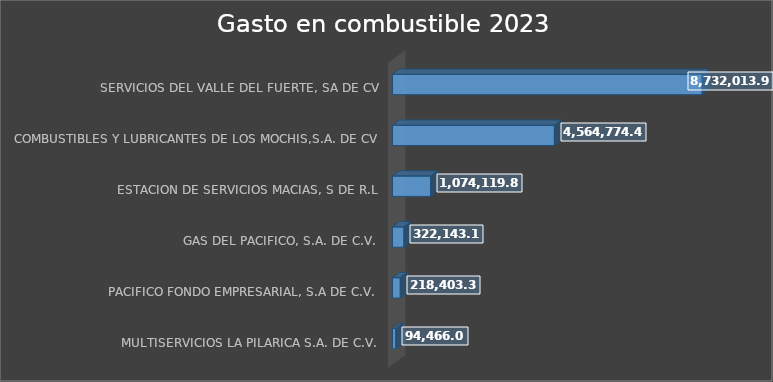
| Category | Suma |
|---|---|
| MULTISERVICIOS LA PILARICA S.A. DE C.V. | 94466.01 |
| PACIFICO FONDO EMPRESARIAL, S.A DE C.V. | 218403.3 |
| GAS DEL PACIFICO, S.A. DE C.V. | 322143.14 |
| ESTACION DE SERVICIOS MACIAS, S DE R.L | 1074119.8 |
| COMBUSTIBLES Y LUBRICANTES DE LOS MOCHIS,S.A. DE CV | 4564774.47 |
| SERVICIOS DEL VALLE DEL FUERTE, SA DE CV | 8732013.9 |